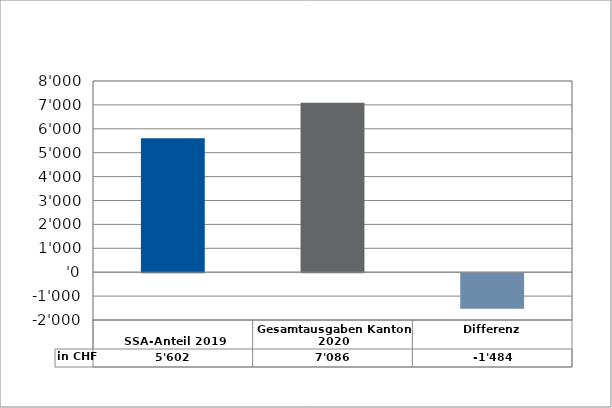
| Category | in CHF |
|---|---|
| 
SSA-Anteil 2019

 | 5602 |
| Gesamtausgaben Kanton 2020
 | 7086.3 |
| Differenz | -1484.3 |